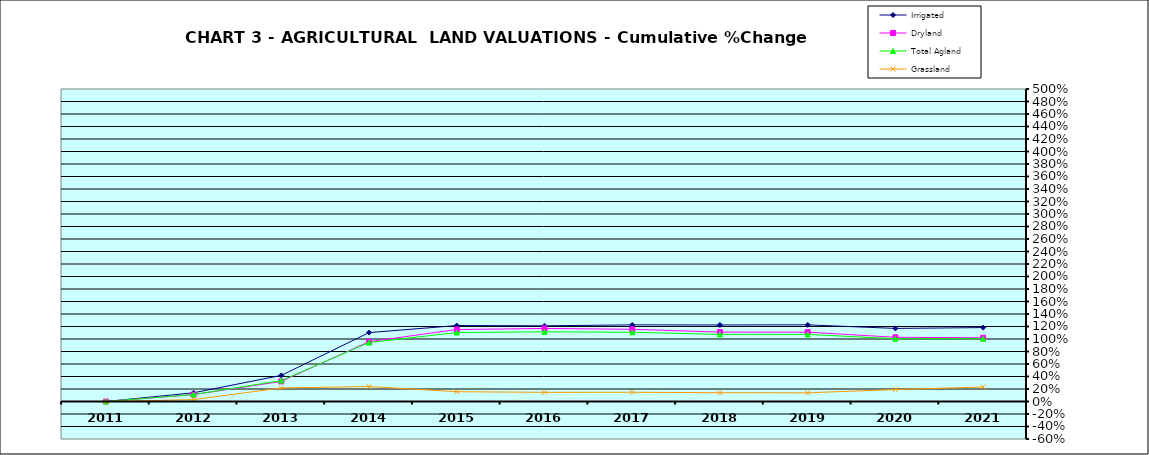
| Category | Irrigated | Dryland | Total Agland | Grassland |
|---|---|---|---|---|
| 2011.0 | 0 | 0 | 0 | 0 |
| 2012.0 | 0.139 | 0.11 | 0.111 | 0.03 |
| 2013.0 | 0.418 | 0.322 | 0.335 | 0.217 |
| 2014.0 | 1.102 | 0.957 | 0.943 | 0.24 |
| 2015.0 | 1.215 | 1.151 | 1.103 | 0.157 |
| 2016.0 | 1.211 | 1.169 | 1.115 | 0.147 |
| 2017.0 | 1.226 | 1.155 | 1.108 | 0.148 |
| 2018.0 | 1.225 | 1.11 | 1.074 | 0.141 |
| 2019.0 | 1.227 | 1.109 | 1.073 | 0.139 |
| 2020.0 | 1.169 | 1.027 | 1.005 | 0.191 |
| 2021.0 | 1.183 | 1.02 | 1.005 | 0.232 |